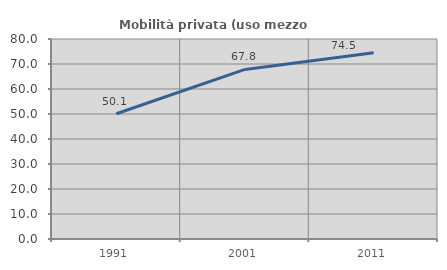
| Category | Mobilità privata (uso mezzo privato) |
|---|---|
| 1991.0 | 50.096 |
| 2001.0 | 67.841 |
| 2011.0 | 74.537 |